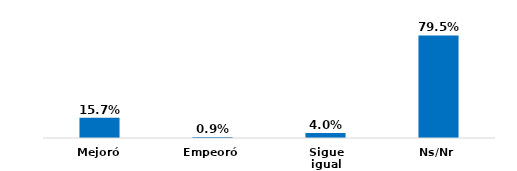
| Category | Series 0 |
|---|---|
| Mejoró | 0.157 |
| Empeoró | 0.009 |
| Sigue igual | 0.04 |
| Ns/Nr | 0.795 |